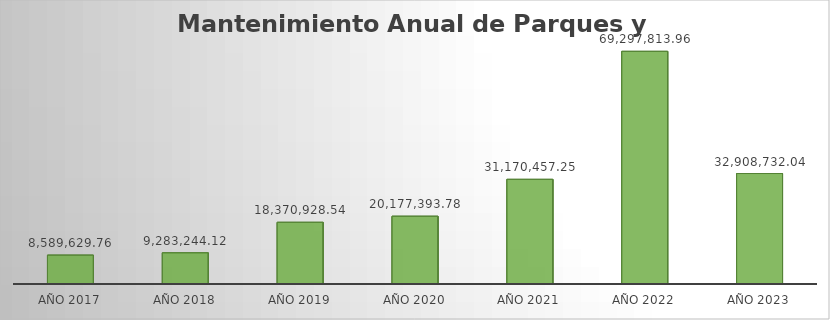
| Category | Suma |
|---|---|
| AÑO 2017 | 8589629.76 |
| AÑO 2018 | 9283244.12 |
| AÑO 2019 | 18370928.54 |
| AÑO 2020 | 20177393.78 |
| AÑO 2021 | 31170457.25 |
| AÑO 2022 | 69297813.96 |
| AÑO 2023 | 32908732.04 |